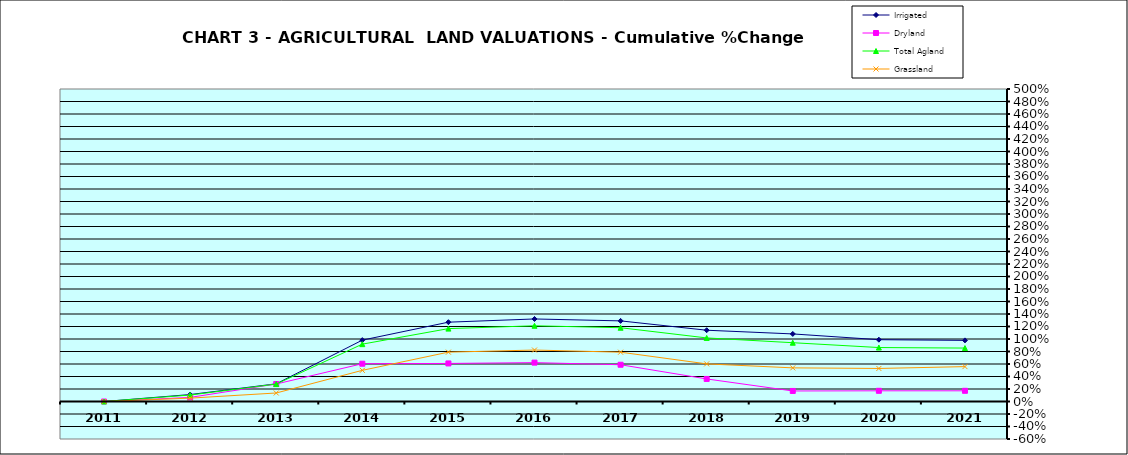
| Category | Irrigated | Dryland | Total Agland | Grassland |
|---|---|---|---|---|
| 2011.0 | 0 | 0 | 0 | 0 |
| 2012.0 | 0.111 | 0.066 | 0.103 | 0.054 |
| 2013.0 | 0.283 | 0.28 | 0.279 | 0.136 |
| 2014.0 | 0.982 | 0.605 | 0.918 | 0.499 |
| 2015.0 | 1.269 | 0.609 | 1.166 | 0.79 |
| 2016.0 | 1.321 | 0.622 | 1.212 | 0.823 |
| 2017.0 | 1.29 | 0.588 | 1.18 | 0.789 |
| 2018.0 | 1.14 | 0.361 | 1.017 | 0.602 |
| 2019.0 | 1.081 | 0.169 | 0.941 | 0.538 |
| 2020.0 | 0.989 | 0.171 | 0.863 | 0.529 |
| 2021.0 | 0.978 | 0.171 | 0.855 | 0.558 |